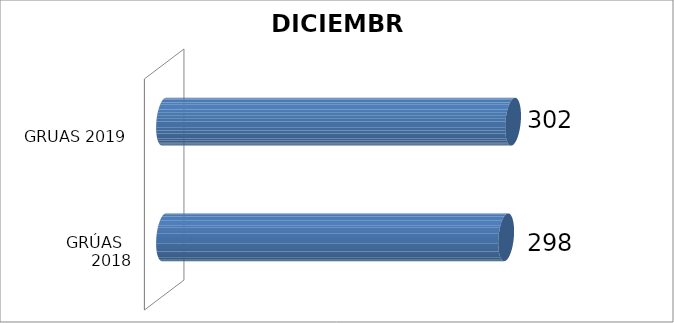
| Category | DICIEMBRE |
|---|---|
| GRÚAS   2018 | 298 |
| GRUAS 2019 | 302 |